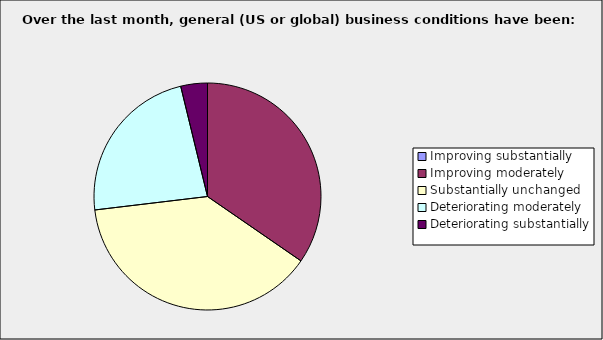
| Category | Series 0 |
|---|---|
| Improving substantially | 0 |
| Improving moderately | 0.346 |
| Substantially unchanged | 0.385 |
| Deteriorating moderately | 0.231 |
| Deteriorating substantially | 0.038 |